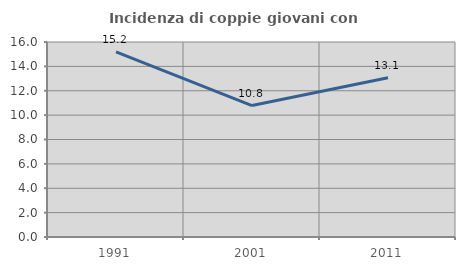
| Category | Incidenza di coppie giovani con figli |
|---|---|
| 1991.0 | 15.188 |
| 2001.0 | 10.786 |
| 2011.0 | 13.063 |